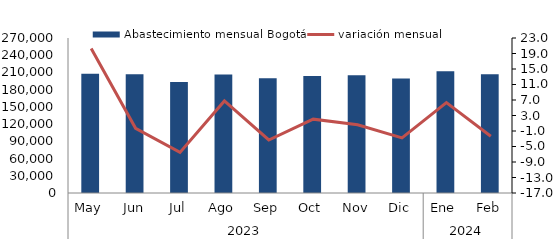
| Category | Abastecimiento mensual Bogotá |
|---|---|
| 0 | 207645.455 |
| 1 | 207031.626 |
| 2 | 193540.689 |
| 3 | 206595.389 |
| 4 | 199736.721 |
| 5 | 203842.748 |
| 6 | 205049.889 |
| 7 | 199371.331 |
| 8 | 212001.678 |
| 9 | 207000.498 |